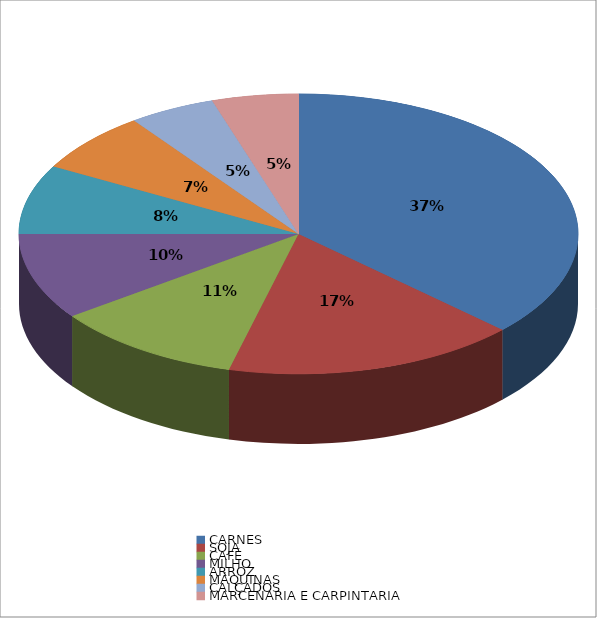
| Category | Series 0 |
|---|---|
| CARNES | 0.37 |
| SOJA | 0.17 |
| CAFÉ | 0.11 |
| MILHO | 0.1 |
| ARROZ  | 0.08 |
| MÁQUINAS | 0.07 |
| CALÇADOS | 0.05 |
| MARCENARIA E CARPINTARIA | 0.05 |